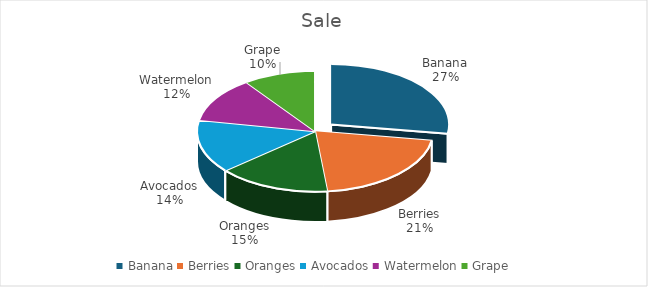
| Category | Sale |
|---|---|
| Banana | 25 |
| Berries | 19 |
| Oranges | 14 |
| Avocados | 13 |
| Watermelon | 11 |
| Grape | 9 |